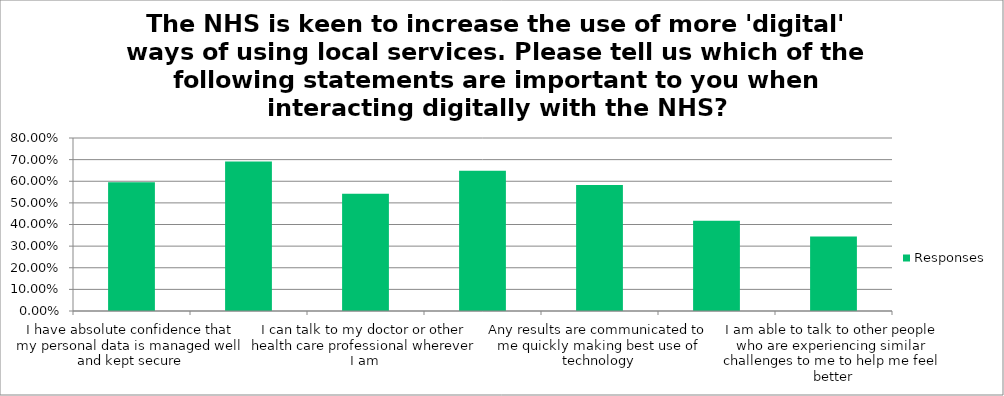
| Category | Responses |
|---|---|
| I have absolute confidence that my personal data is managed well and kept secure | 0.595 |
| I can access services using my phone or computer | 0.691 |
| I can talk to my doctor or other health care professional wherever I am | 0.542 |
| I can make appointments online and my options are not limited | 0.649 |
| Any results are communicated to me quickly making best use of technology | 0.583 |
| I manage my own personal records so that I can receive continuity in care | 0.417 |
| I am able to talk to other people who are experiencing similar challenges to me to help me feel better | 0.344 |